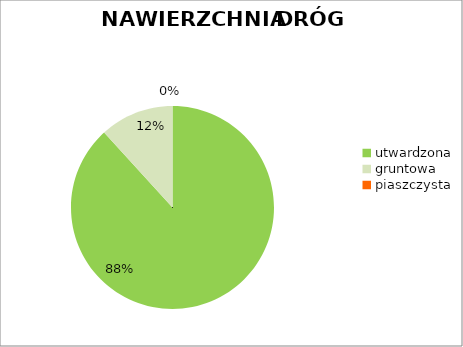
| Category | Series 0 |
|---|---|
| utwardzona | 0.882 |
| gruntowa | 0.118 |
| piaszczysta | 0 |